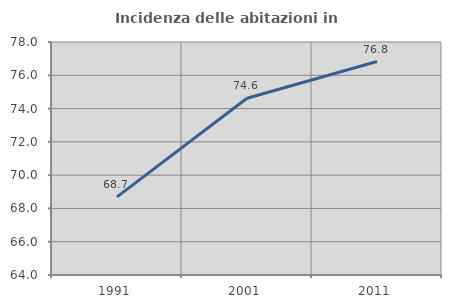
| Category | Incidenza delle abitazioni in proprietà  |
|---|---|
| 1991.0 | 68.694 |
| 2001.0 | 74.617 |
| 2011.0 | 76.826 |